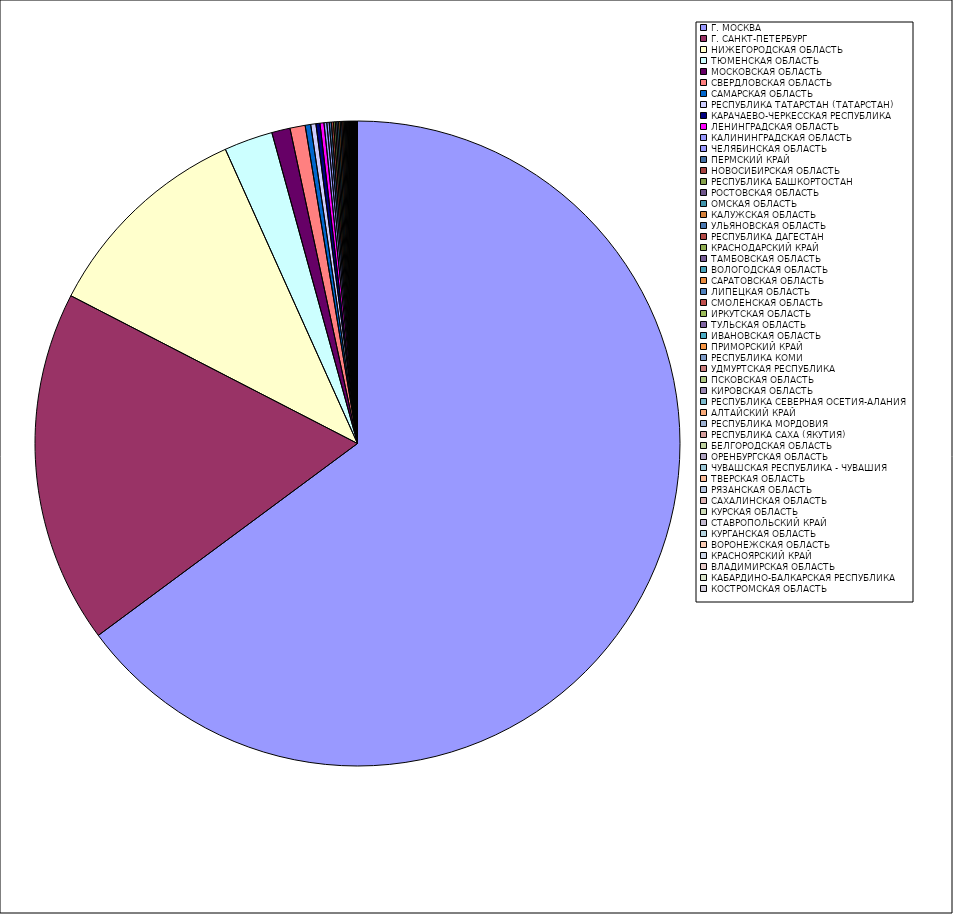
| Category | Оборот |
|---|---|
| Г. МОСКВА | 64.84 |
| Г. САНКТ-ПЕТЕРБУРГ | 17.714 |
| НИЖЕГОРОДСКАЯ ОБЛАСТЬ | 10.704 |
| ТЮМЕНСКАЯ ОБЛАСТЬ | 2.438 |
| МОСКОВСКАЯ ОБЛАСТЬ | 0.919 |
| СВЕРДЛОВСКАЯ ОБЛАСТЬ | 0.762 |
| САМАРСКАЯ ОБЛАСТЬ | 0.278 |
| РЕСПУБЛИКА ТАТАРСТАН (ТАТАРСТАН) | 0.258 |
| КАРАЧАЕВО-ЧЕРКЕССКАЯ РЕСПУБЛИКА | 0.203 |
| ЛЕНИНГРАДСКАЯ ОБЛАСТЬ | 0.199 |
| КАЛИНИНГРАДСКАЯ ОБЛАСТЬ | 0.141 |
| ЧЕЛЯБИНСКАЯ ОБЛАСТЬ | 0.117 |
| ПЕРМСКИЙ КРАЙ | 0.106 |
| НОВОСИБИРСКАЯ ОБЛАСТЬ | 0.105 |
| РЕСПУБЛИКА БАШКОРТОСТАН | 0.088 |
| РОСТОВСКАЯ ОБЛАСТЬ | 0.083 |
| ОМСКАЯ ОБЛАСТЬ | 0.082 |
| КАЛУЖСКАЯ ОБЛАСТЬ | 0.08 |
| УЛЬЯНОВСКАЯ ОБЛАСТЬ | 0.071 |
| РЕСПУБЛИКА ДАГЕСТАН | 0.068 |
| КРАСНОДАРСКИЙ КРАЙ | 0.061 |
| ТАМБОВСКАЯ ОБЛАСТЬ | 0.054 |
| ВОЛОГОДСКАЯ ОБЛАСТЬ | 0.048 |
| САРАТОВСКАЯ ОБЛАСТЬ | 0.044 |
| ЛИПЕЦКАЯ ОБЛАСТЬ | 0.04 |
| СМОЛЕНСКАЯ ОБЛАСТЬ | 0.035 |
| ИРКУТСКАЯ ОБЛАСТЬ | 0.032 |
| ТУЛЬСКАЯ ОБЛАСТЬ | 0.032 |
| ИВАНОВСКАЯ ОБЛАСТЬ | 0.03 |
| ПРИМОРСКИЙ КРАЙ | 0.029 |
| РЕСПУБЛИКА КОМИ | 0.027 |
| УДМУРТСКАЯ РЕСПУБЛИКА | 0.027 |
| ПСКОВСКАЯ ОБЛАСТЬ | 0.023 |
| КИРОВСКАЯ ОБЛАСТЬ | 0.02 |
| РЕСПУБЛИКА СЕВЕРНАЯ ОСЕТИЯ-АЛАНИЯ | 0.019 |
| АЛТАЙСКИЙ КРАЙ | 0.019 |
| РЕСПУБЛИКА МОРДОВИЯ | 0.019 |
| РЕСПУБЛИКА САХА (ЯКУТИЯ) | 0.018 |
| БЕЛГОРОДСКАЯ ОБЛАСТЬ | 0.018 |
| ОРЕНБУРГСКАЯ ОБЛАСТЬ | 0.017 |
| ЧУВАШСКАЯ РЕСПУБЛИКА - ЧУВАШИЯ | 0.016 |
| ТВЕРСКАЯ ОБЛАСТЬ | 0.013 |
| РЯЗАНСКАЯ ОБЛАСТЬ | 0.012 |
| САХАЛИНСКАЯ ОБЛАСТЬ | 0.011 |
| КУРСКАЯ ОБЛАСТЬ | 0.01 |
| СТАВРОПОЛЬСКИЙ КРАЙ | 0.009 |
| КУРГАНСКАЯ ОБЛАСТЬ | 0.008 |
| ВОРОНЕЖСКАЯ ОБЛАСТЬ | 0.007 |
| КРАСНОЯРСКИЙ КРАЙ | 0.005 |
| ВЛАДИМИРСКАЯ ОБЛАСТЬ | 0.005 |
| КАБАРДИНО-БАЛКАРСКАЯ РЕСПУБЛИКА | 0.005 |
| КОСТРОМСКАЯ ОБЛАСТЬ | 0.005 |